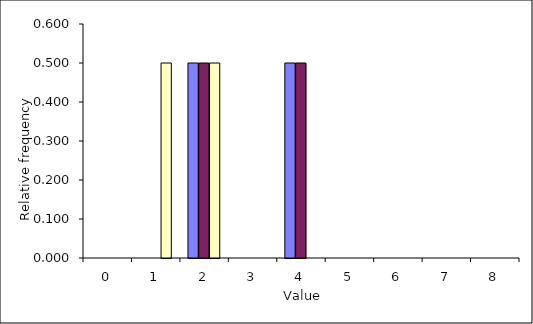
| Category | Series 0 | Series 1 | Series 2 |
|---|---|---|---|
| 0.0 | 0 | 0 | 0 |
| 1.0 | 0 | 0 | 0.5 |
| 2.0 | 0.5 | 0.5 | 0.5 |
| 3.0 | 0 | 0 | 0 |
| 4.0 | 0.5 | 0.5 | 0 |
| 5.0 | 0 | 0 | 0 |
| 6.0 | 0 | 0 | 0 |
| 7.0 | 0 | 0 | 0 |
| 8.0 | 0 | 0 | 0 |